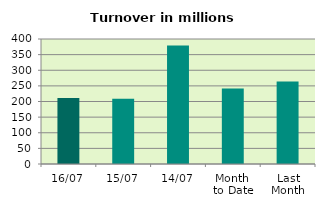
| Category | Series 0 |
|---|---|
| 16/07 | 210.913 |
| 15/07 | 208.961 |
| 14/07 | 379.26 |
| Month 
to Date | 241.761 |
| Last
Month | 264.074 |